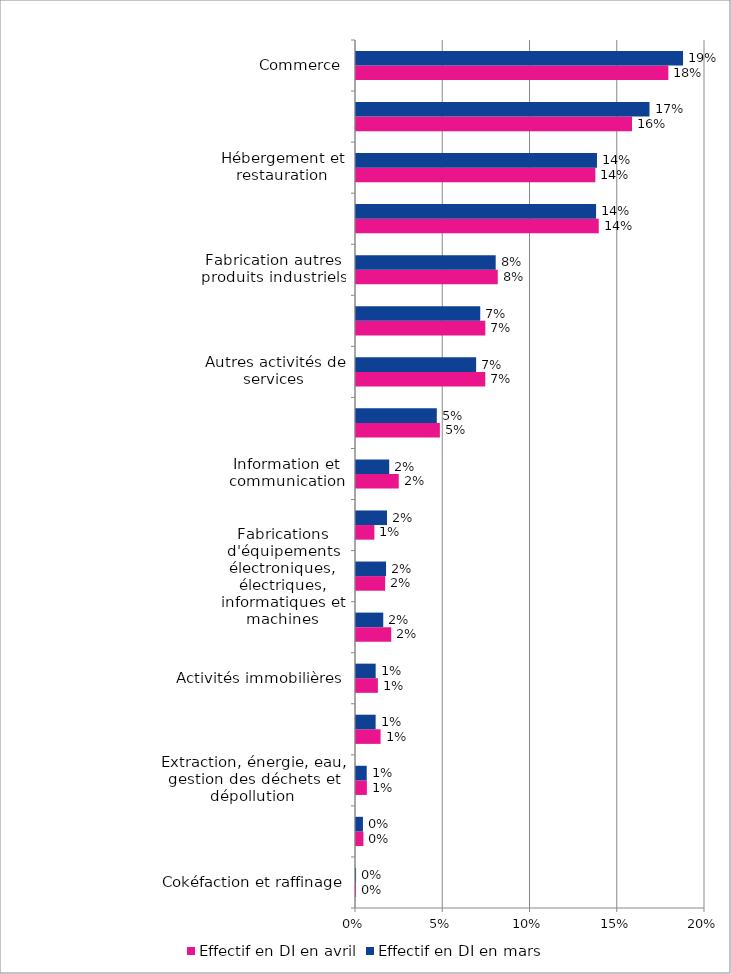
| Category | Effectif en DI en avril | Effectif en DI en mars |
|---|---|---|
| Cokéfaction et raffinage | 0 | 0 |
| Agriculture, sylviculture et pêche | 0.004 | 0.004 |
| Extraction, énergie, eau, gestion des déchets et dépollution | 0.006 | 0.006 |
| Activités financières et d'assurance | 0.014 | 0.011 |
| Activités immobilières | 0.013 | 0.011 |
| Fabrication d'aliments, boissons et produits à base de tabac | 0.02 | 0.016 |
| Fabrications d'équipements électroniques, électriques, informatiques et machines | 0.017 | 0.017 |
| Fabrication de matériels de transport | 0.011 | 0.018 |
| Information et communication | 0.024 | 0.019 |
| Transports et entreposage | 0.048 | 0.046 |
| Autres activités de services | 0.074 | 0.069 |
| Administration publique, enseignement, santé et action sociale | 0.074 | 0.071 |
| Fabrication autres produits industriels | 0.081 | 0.08 |
| Construction | 0.139 | 0.138 |
| Hébergement et restauration | 0.137 | 0.138 |
| Activités spécialisées, scientifiques et techniques, services admnistratifs et de soutien | 0.158 | 0.168 |
| Commerce | 0.179 | 0.187 |